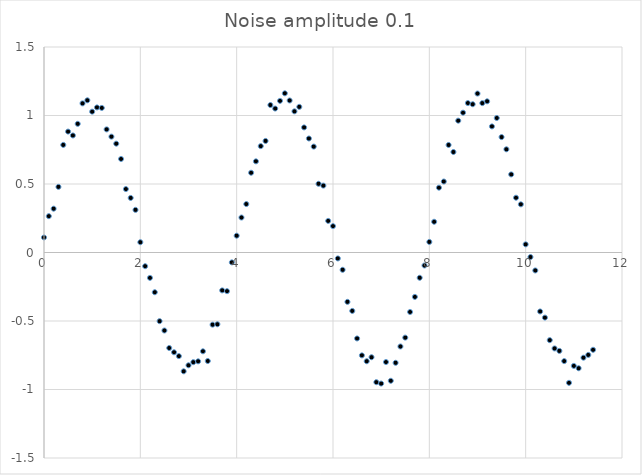
| Category | Series 0 |
|---|---|
| 0.0 | 0.11 |
| 0.1 | 0.265 |
| 0.2 | 0.32 |
| 0.3 | 0.479 |
| 0.4 | 0.785 |
| 0.5 | 0.883 |
| 0.6 | 0.854 |
| 0.7 | 0.939 |
| 0.8 | 1.089 |
| 0.9 | 1.111 |
| 1.0 | 1.028 |
| 1.1 | 1.059 |
| 1.2 | 1.055 |
| 1.3 | 0.899 |
| 1.4 | 0.846 |
| 1.5 | 0.794 |
| 1.6 | 0.683 |
| 1.7 | 0.463 |
| 1.8 | 0.398 |
| 1.900000000000001 | 0.311 |
| 2.0 | 0.075 |
| 2.100000000000001 | -0.1 |
| 2.200000000000001 | -0.185 |
| 2.300000000000001 | -0.29 |
| 2.400000000000001 | -0.501 |
| 2.500000000000001 | -0.569 |
| 2.600000000000001 | -0.697 |
| 2.700000000000001 | -0.728 |
| 2.800000000000001 | -0.756 |
| 2.900000000000001 | -0.867 |
| 3.000000000000001 | -0.823 |
| 3.100000000000001 | -0.801 |
| 3.200000000000001 | -0.794 |
| 3.300000000000002 | -0.721 |
| 3.400000000000002 | -0.792 |
| 3.500000000000002 | -0.527 |
| 3.600000000000002 | -0.524 |
| 3.700000000000002 | -0.277 |
| 3.800000000000002 | -0.282 |
| 3.900000000000002 | -0.072 |
| 4.000000000000002 | 0.123 |
| 4.100000000000001 | 0.255 |
| 4.200000000000001 | 0.354 |
| 4.300000000000001 | 0.582 |
| 4.4 | 0.665 |
| 4.5 | 0.776 |
| 4.6 | 0.814 |
| 4.699999999999999 | 1.077 |
| 4.799999999999999 | 1.051 |
| 4.899999999999999 | 1.107 |
| 4.999999999999998 | 1.162 |
| 5.099999999999998 | 1.11 |
| 5.199999999999997 | 1.03 |
| 5.299999999999997 | 1.063 |
| 5.399999999999997 | 0.913 |
| 5.499999999999996 | 0.832 |
| 5.599999999999996 | 0.773 |
| 5.699999999999996 | 0.501 |
| 5.799999999999995 | 0.488 |
| 5.899999999999995 | 0.231 |
| 5.999999999999994 | 0.193 |
| 6.099999999999994 | -0.043 |
| 6.199999999999994 | -0.126 |
| 6.299999999999994 | -0.36 |
| 6.399999999999993 | -0.426 |
| 6.499999999999993 | -0.627 |
| 6.599999999999993 | -0.751 |
| 6.699999999999992 | -0.794 |
| 6.799999999999992 | -0.764 |
| 6.899999999999991 | -0.947 |
| 6.999999999999991 | -0.957 |
| 7.099999999999991 | -0.8 |
| 7.19999999999999 | -0.936 |
| 7.29999999999999 | -0.805 |
| 7.39999999999999 | -0.686 |
| 7.49999999999999 | -0.621 |
| 7.599999999999989 | -0.434 |
| 7.699999999999989 | -0.324 |
| 7.799999999999988 | -0.184 |
| 7.899999999999988 | -0.095 |
| 7.999999999999987 | 0.077 |
| 8.099999999999987 | 0.224 |
| 8.199999999999987 | 0.473 |
| 8.299999999999986 | 0.518 |
| 8.399999999999986 | 0.785 |
| 8.499999999999986 | 0.734 |
| 8.599999999999985 | 0.962 |
| 8.699999999999983 | 1.02 |
| 8.799999999999985 | 1.091 |
| 8.899999999999984 | 1.082 |
| 8.999999999999982 | 1.16 |
| 9.099999999999984 | 1.09 |
| 9.199999999999983 | 1.104 |
| 9.299999999999981 | 0.92 |
| 9.39999999999998 | 0.982 |
| 9.49999999999998 | 0.843 |
| 9.59999999999998 | 0.753 |
| 9.69999999999998 | 0.57 |
| 9.79999999999998 | 0.4 |
| 9.89999999999998 | 0.352 |
| 9.99999999999998 | 0.059 |
| 10.09999999999998 | -0.033 |
| 10.19999999999998 | -0.131 |
| 10.29999999999998 | -0.43 |
| 10.39999999999998 | -0.475 |
| 10.49999999999998 | -0.64 |
| 10.59999999999998 | -0.7 |
| 10.69999999999998 | -0.718 |
| 10.79999999999998 | -0.793 |
| 10.89999999999998 | -0.951 |
| 10.99999999999998 | -0.828 |
| 11.09999999999998 | -0.845 |
| 11.19999999999998 | -0.768 |
| 11.29999999999998 | -0.748 |
| 11.39999999999998 | -0.71 |